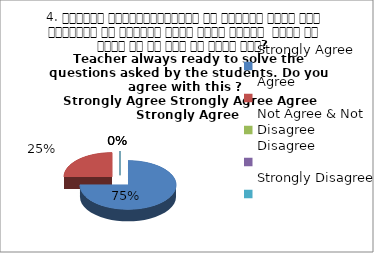
| Category | 4. शिक्षक विद्यार्थियों के द्वारा पूछे गये प्रश्नो का समाधान करने हेतु तत्पर  रहते है क्या आप इस बात से सहमत हैं? 
 Teacher always ready to solve the questions asked by the students. Do you agree with this ? 
 Strongly Agree Strongly Agree Agree Strongly  |
|---|---|
| Strongly Agree | 3 |
| Agree | 1 |
| Not Agree & Not Disagree | 0 |
| Disagree | 0 |
| Strongly Disagree | 0 |